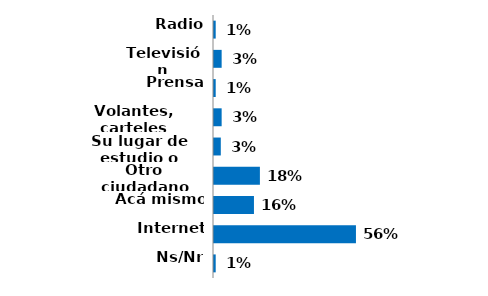
| Category | Series 0 |
|---|---|
| Radio | 0.007 |
| Televisión | 0.03 |
| Prensa | 0.007 |
| Volantes, carteles | 0.03 |
| Su lugar de estudio o trabajo | 0.027 |
| Otro ciudadano | 0.18 |
| Acá mismo | 0.157 |
| Internet | 0.557 |
| Ns/Nr | 0.007 |